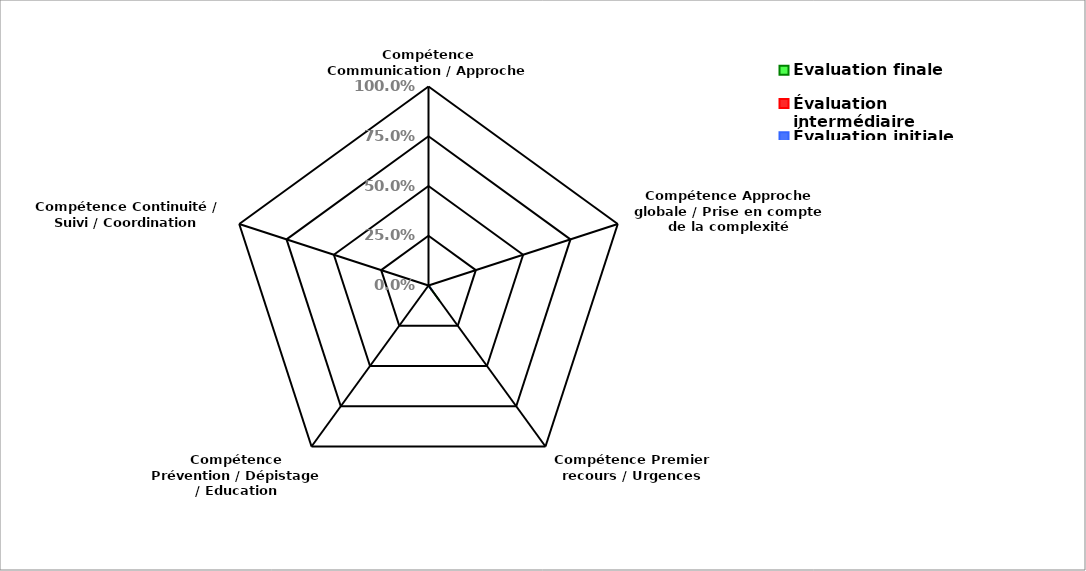
| Category | Évaluation finale | Évaluation intermédiaire | Évaluation initiale |
|---|---|---|---|
| Compétence Communication / Approche centrée patient | 0 | 0 | 0 |
| Compétence Approche globale / Prise en compte de la complexité | 0 | 0 | 0 |
| Compétence Premier recours / Urgences | 0.094 | 0 | 0.031 |
| Compétence Prévention / Dépistage / Education thérapeutique  | 0 | 0 | 0 |
| Compétence Continuité / Suivi / Coordination | 0 | 0 | 0 |